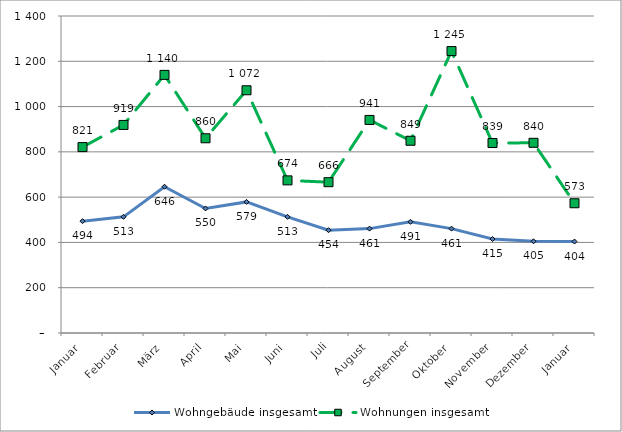
| Category | Wohngebäude insgesamt | Wohnungen insgesamt |
|---|---|---|
| Januar | 494 | 821 |
| Februar | 513 | 919 |
| März | 646 | 1140 |
| April | 550 | 860 |
| Mai | 579 | 1072 |
| Juni | 513 | 674 |
| Juli | 454 | 666 |
| August | 461 | 941 |
| September | 491 | 849 |
| Oktober | 461 | 1245 |
| November | 415 | 839 |
| Dezember | 405 | 840 |
| Januar | 404 | 573 |